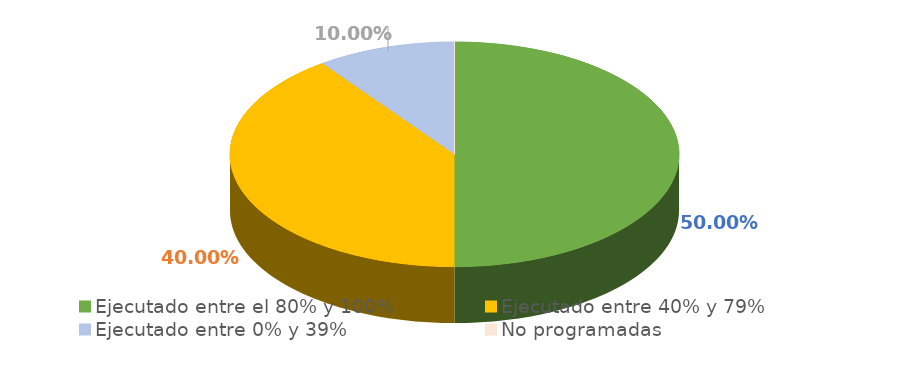
| Category | Series 0 |
|---|---|
| Ejecutado entre el 80% y 100% | 0.5 |
| Ejecutado entre 40% y 79% | 0.4 |
| Ejecutado entre 0% y 39% | 0.1 |
| No programadas | 0 |